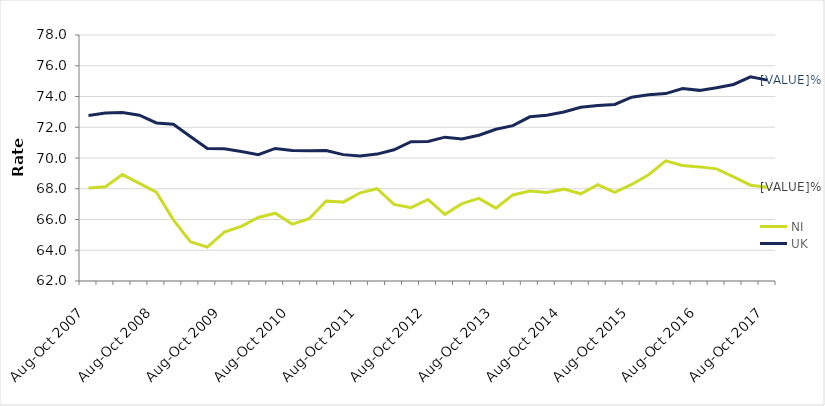
| Category | NI | UK |
|---|---|---|
| Aug-Oct 2007 | 68.05 | 72.767 |
| Nov-Jan 2008 | 68.125 | 72.932 |
| Feb-Apr 2008 | 68.922 | 72.964 |
| May-Jul 2008 | 68.347 | 72.787 |
| Aug-Oct 2008 | 67.774 | 72.28 |
| Nov-Jan 2009 | 65.977 | 72.194 |
| Feb-Apr 2009 | 64.562 | 71.396 |
| May-Jul 2009 | 64.206 | 70.615 |
| Aug-Oct 2009 | 65.187 | 70.6 |
| Nov-Jan 2010 | 65.558 | 70.416 |
| Feb-Apr 2010 | 66.133 | 70.214 |
| May-Jul 2010 | 66.41 | 70.621 |
| Aug-Oct 2010 | 65.703 | 70.49 |
| Nov-Jan 2011 | 66.046 | 70.469 |
| Feb-Apr 2011 | 67.208 | 70.482 |
| May-Jul 2011 | 67.131 | 70.22 |
| Aug-Oct 2011 | 67.731 | 70.124 |
| Nov-Jan 2012 | 68.002 | 70.253 |
| Feb-Apr 2012 | 66.985 | 70.532 |
| May-Jul 2012 | 66.768 | 71.06 |
| Aug-Oct 2012 | 67.3 | 71.07 |
| Nov-Jan 2013 | 66.337 | 71.356 |
| Feb-Apr 2013 | 67.032 | 71.234 |
| May-Jul 2013 | 67.372 | 71.48 |
| Aug-Oct 2013 | 66.742 | 71.868 |
| Nov-Jan 2014 | 67.599 | 72.105 |
| Feb-Apr 2014 | 67.852 | 72.678 |
| May-Jul 2014 | 67.76 | 72.781 |
| Aug-Oct 2014 | 67.974 | 72.989 |
| Nov-Jan 2015 | 67.673 | 73.305 |
| Feb-Apr 2015 | 68.262 | 73.419 |
| May-Jul 2015 | 67.763 | 73.481 |
| Aug-Oct 2015 | 68.279 | 73.952 |
| Nov-Jan 2016 | 68.909 | 74.112 |
| Feb-Apr 2016 | 69.814 | 74.188 |
| May-Jul 2016 | 69.509 | 74.521 |
| Aug-Oct 2016 | 69.422 | 74.399 |
| Nov-Jan 2017 | 69.293 | 74.574 |
| Feb-Apr 2017 | 68.77 | 74.783 |
| May-Jul 2017 | 68.233 | 75.277 |
| Aug-Oct 2017 | 68.1 | 75.066 |